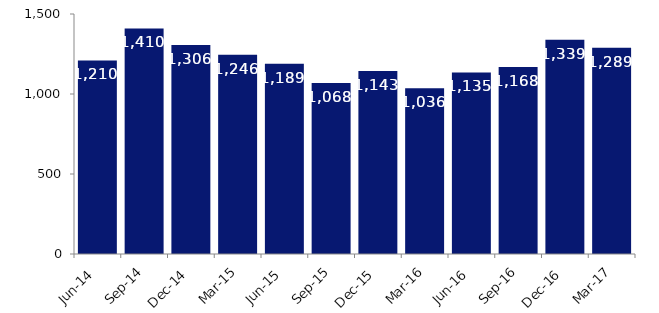
| Category | Series 0 |
|---|---|
| Jun-14 | 1210 |
| Sep-14 | 1410 |
| Dec-14 | 1306 |
| Mar-15 | 1246 |
| Jun-15 | 1189 |
| Sep-15 | 1068 |
| Dec-15 | 1143 |
| Mar-16 | 1036 |
| Jun-16 | 1135 |
| Sep-16 | 1168 |
| Dec-16 | 1339 |
| Mar-17 | 1289 |